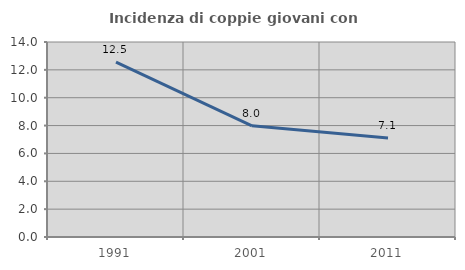
| Category | Incidenza di coppie giovani con figli |
|---|---|
| 1991.0 | 12.548 |
| 2001.0 | 7.981 |
| 2011.0 | 7.115 |